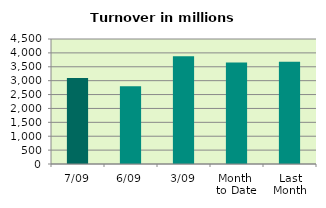
| Category | Series 0 |
|---|---|
| 7/09 | 3099.971 |
| 6/09 | 2802.536 |
| 3/09 | 3878.301 |
| Month 
to Date | 3650.755 |
| Last
Month | 3679.291 |